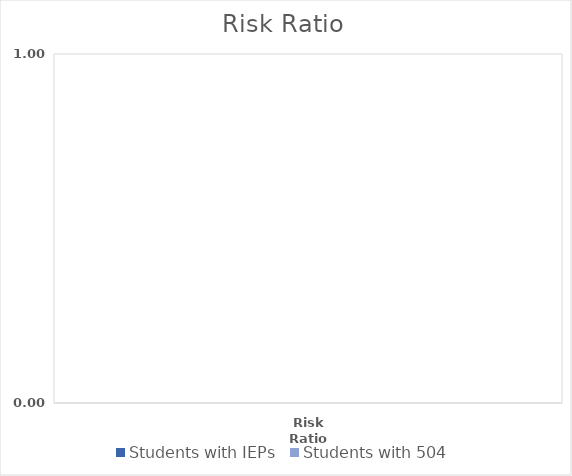
| Category | Students with IEPs | Students with 504 |
|---|---|---|
| Risk Ratio | 0 | 0 |